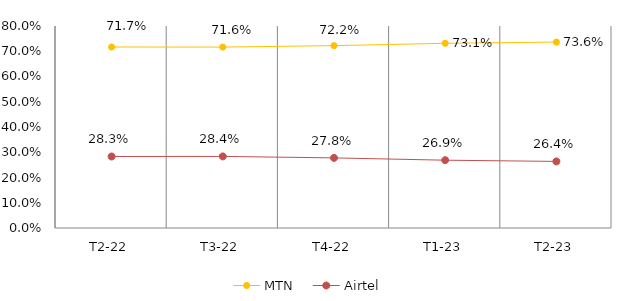
| Category | MTN | Airtel |
|---|---|---|
| T2-22 | 0.717 | 0.283 |
| T3-22 | 0.716 | 0.284 |
| T4-22 | 0.722 | 0.278 |
| T1-23 | 0.731 | 0.269 |
| T2-23 | 0.736 | 0.264 |